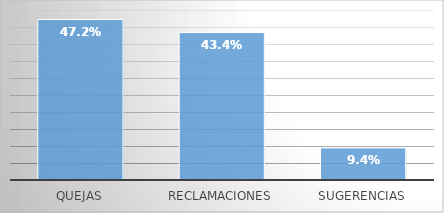
| Category | PORCENTAJE |
|---|---|
| Quejas | 0.472 |
| Reclamaciones | 0.434 |
| Sugerencias | 0.094 |